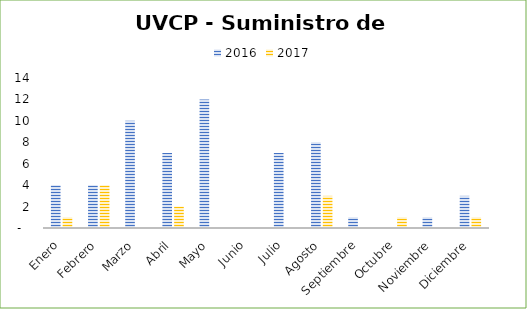
| Category | 2016 | 2017 |
|---|---|---|
| Enero | 4 | 1 |
| Febrero | 4 | 4 |
| Marzo | 10 | 0 |
| Abril | 7 | 2 |
| Mayo | 12 | 0 |
| Junio | 0 | 0 |
| Julio | 7 | 0 |
| Agosto | 8 | 3 |
| Septiembre | 1 | 0 |
| Octubre | 0 | 1 |
| Noviembre | 1 | 0 |
| Diciembre | 3 | 1 |